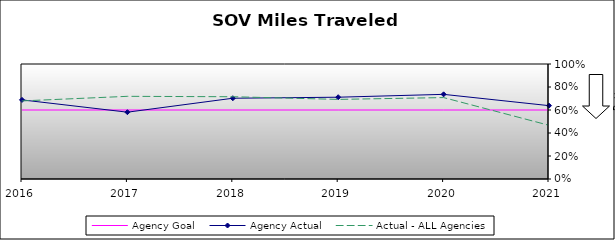
| Category | Agency Goal | Agency Actual | Actual - ALL Agencies |
|---|---|---|---|
| 2016.0 | 0.6 | 0.688 | 0.679 |
| 2017.0 | 0.6 | 0.581 | 0.719 |
| 2018.0 | 0.6 | 0.702 | 0.715 |
| 2019.0 | 0.6 | 0.711 | 0.692 |
| 2020.0 | 0.6 | 0.736 | 0.708 |
| 2021.0 | 0.6 | 0.638 | 0.467 |